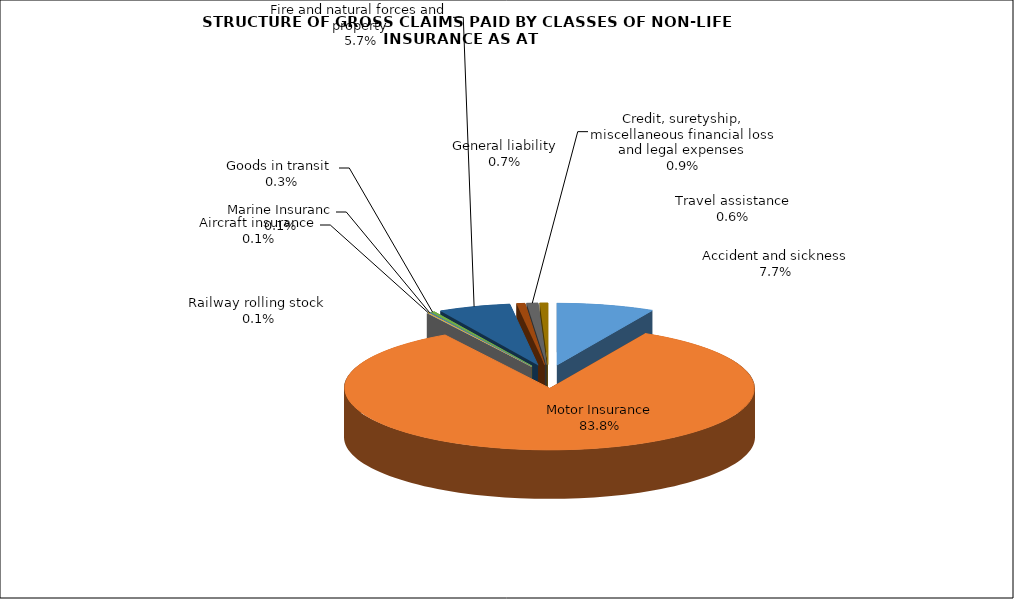
| Category | Accident and sickness | Series 1 |
|---|---|---|
| Accident and sickness | 0.077 |  |
| Motor Insurance | 0.838 |  |
| Railway rolling stock  | 0.001 |  |
| Aircraft insurance | 0.001 |  |
| Marine Insuranc | 0.001 |  |
| Goods in transit  | 0.003 |  |
| Fire and natural forces and property | 0.057 |  |
| General liability | 0.007 |  |
| Credit, suretyship, miscellaneous financial loss and legal expenses | 0.009 |  |
| Travel assistance | 0.006 |  |